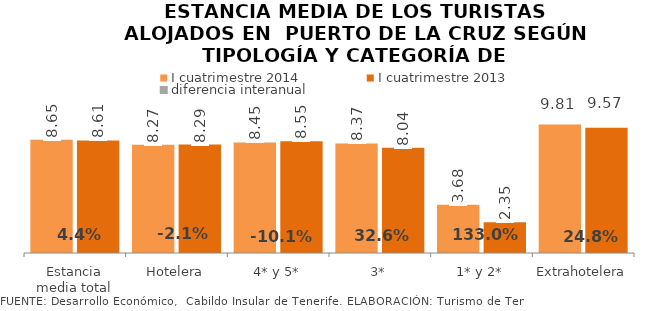
| Category | I cuatrimestre 2014 | I cuatrimestre 2013 |
|---|---|---|
| Estancia media total | 8.651 | 8.607 |
| Hotelera | 8.267 | 8.288 |
| 4* y 5* | 8.447 | 8.548 |
| 3* | 8.37 | 8.043 |
| 1* y 2* | 3.683 | 2.353 |
| Extrahotelera | 9.813 | 9.565 |